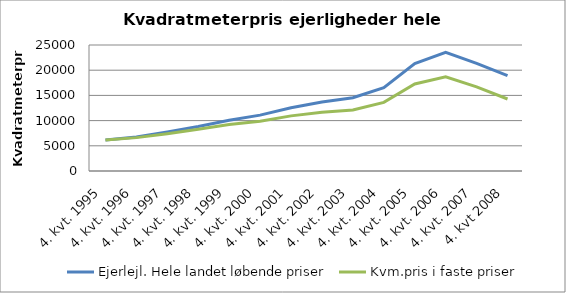
| Category | Ejerlejl. Hele landet løbende priser | Kvm.pris i faste priser |
|---|---|---|
| 4. kvt. 1995 | 6168 | 6168 |
| 4. kvt. 1996 | 6761 | 6621.117 |
| 4. kvt. 1997 | 7726 | 7403.688 |
| 4. kvt. 1998 | 8814 | 8293.655 |
| 4. kvt. 1999 | 10072 | 9247.138 |
| 4. kvt. 2000 | 11087 | 9890.288 |
| 4. kvt. 2001 | 12553 | 10939.81 |
| 4. kvt. 2002 | 13697 | 11655.01 |
| 4. kvt. 2003 | 14547 | 12125.088 |
| 4. kvt. 2004 | 16525 | 13616.344 |
| 4. kvt. 2005 | 21326 | 17259.695 |
| 4. kvt. 2006 | 23522 | 18682.049 |
| 4. kvt. 2007 | 21372 | 16688.751 |
| 4. kvt 2008 | 18913 | 14283.049 |